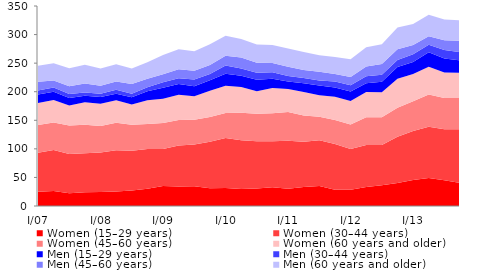
| Category | Women (15–29 years) | Women (30–44 years) | Women (45–60 years) | Women (60 years and older) | Men (15–29 years) | Men (30–44 years) | Men (45–60 years) | Men (60 years and older) |
|---|---|---|---|---|---|---|---|---|
|  I/07 | 25.024 | 68.304 | 48.443 | 38.555 | 14.746 | 7.245 | 15.174 | 27.794 |
|  II | 26.032 | 71.963 | 48.335 | 39.065 | 14.511 | 7.259 | 12.409 | 30.231 |
|  III | 22.155 | 68.942 | 49.692 | 35.209 | 12.902 | 6.915 | 13.81 | 31.516 |
|  IV | 24.251 | 68.191 | 49.581 | 39.36 | 11.397 | 5.702 | 15.82 | 33.048 |
|  I/08 | 24.658 | 69.174 | 46.086 | 38.839 | 11.836 | 5.898 | 14.059 | 29.986 |
|  II | 25.49 | 72.184 | 48.149 | 39.237 | 11.591 | 6.751 | 14.658 | 30.053 |
|  III | 27.105 | 69.656 | 45.281 | 35.64 | 12.48 | 6.297 | 17.164 | 27.172 |
|  IV | 30.187 | 69.477 | 43.939 | 41.328 | 15.778 | 7.189 | 14.859 | 28.833 |
|  I/09 | 34.819 | 64.872 | 45.738 | 42.337 | 19.133 | 9.449 | 14.097 | 33.857 |
|  II | 34.212 | 71.688 | 44.804 | 44.097 | 18.595 | 10.04 | 15.874 | 34.944 |
|  III | 34.395 | 73.318 | 43.171 | 41.146 | 17.439 | 11.874 | 15.169 | 34.371 |
|  IV | 30.882 | 81.555 | 43.4 | 45.971 | 18.154 | 11.142 | 15.455 | 36.407 |
|  I/10 | 31.691 | 87.379 | 43.838 | 47.499 | 21.078 | 14.177 | 17.31 | 35.066 |
|  II | 29.95 | 85.114 | 48.243 | 44.795 | 19.931 | 12.596 | 19.046 | 32.454 |
|  III | 30.654 | 82.612 | 48.216 | 39.372 | 19.909 | 12.242 | 17.513 | 32.023 |
|  IV | 32.605 | 80.806 | 49.057 | 43.952 | 16.329 | 11.401 | 16.11 | 31.492 |
|  I/11 | 30.311 | 83.811 | 50.466 | 40.126 | 13.153 | 9.718 | 15.929 | 31.992 |
|  II | 33.222 | 79.277 | 46.089 | 40.76 | 15.642 | 8.964 | 14.039 | 31.451 |
|  III | 34.847 | 80.414 | 41.072 | 37.448 | 17.238 | 8.798 | 15.27 | 28.879 |
|  IV | 28.299 | 80.346 | 41.643 | 41.075 | 16.171 | 10.443 | 13.017 | 29.565 |
|  I/12 | 28.571 | 71.105 | 43.085 | 41.111 | 16.292 | 11.28 | 14.275 | 31.141 |
|  II | 33.323 | 73.63 | 48.441 | 44.204 | 15.048 | 12.305 | 17.046 | 33.598 |
|  III | 36.356 | 70.495 | 48.485 | 43.862 | 18.249 | 12.342 | 18.65 | 34.67 |
|  IV | 40.294 | 80.754 | 50.741 | 50.842 | 20.443 | 12.379 | 18.717 | 38.374 |
|  I/13 | 45.561 | 85.497 | 52.315 | 47.775 | 20.923 | 13.605 | 16.22 | 36.814 |
|  II | 49.024 | 89.544 | 56.412 | 48.786 | 25.506 | 13.074 | 14.612 | 37.637 |
|  III | 45.26 | 89.197 | 54.618 | 44.382 | 24.651 | 14.997 | 16.987 | 36.495 |
|  IV | 40.31 | 93.774 | 54.842 | 44.129 | 21.868 | 14.341 | 20.052 | 35.581 |